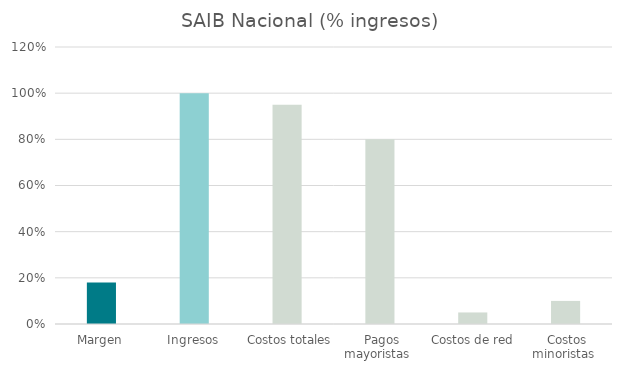
| Category | Series 0 |
|---|---|
|  Margen  | 0.18 |
|  Ingresos  | 1 |
|  Costos totales  | 0.95 |
|  Pagos mayoristas  | 0.8 |
|  Costos de red  | 0.05 |
|  Costos minoristas  | 0.1 |